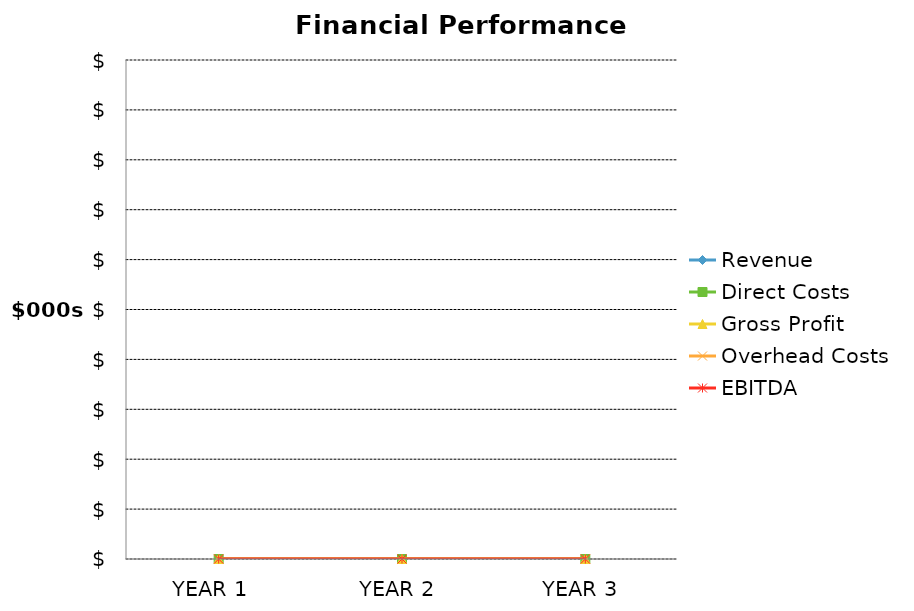
| Category | Revenue | Direct Costs | Gross Profit | Overhead Costs | EBITDA |
|---|---|---|---|---|---|
| YEAR 1  | 0 | 0 | 0 | 0 | 0 |
| YEAR 2 | 0 | 0 | 0 | 0 | 0 |
| YEAR 3 | 0 | 0 | 0 | 0 | 0 |